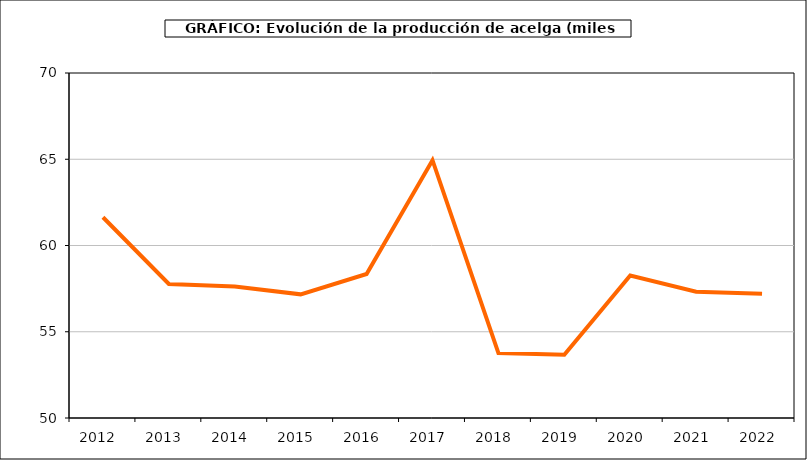
| Category | producción |
|---|---|
| 2012.0 | 61.638 |
| 2013.0 | 57.773 |
| 2014.0 | 57.619 |
| 2015.0 | 57.168 |
| 2016.0 | 58.349 |
| 2017.0 | 64.944 |
| 2018.0 | 53.766 |
| 2019.0 | 53.672 |
| 2020.0 | 58.257 |
| 2021.0 | 57.321 |
| 2022.0 | 57.208 |